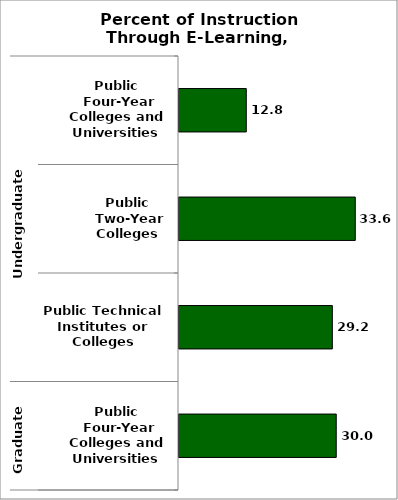
| Category | State |
|---|---|
| 0 | 12.815 |
| 1 | 33.578 |
| 2 | 29.208 |
| 3 | 29.952 |